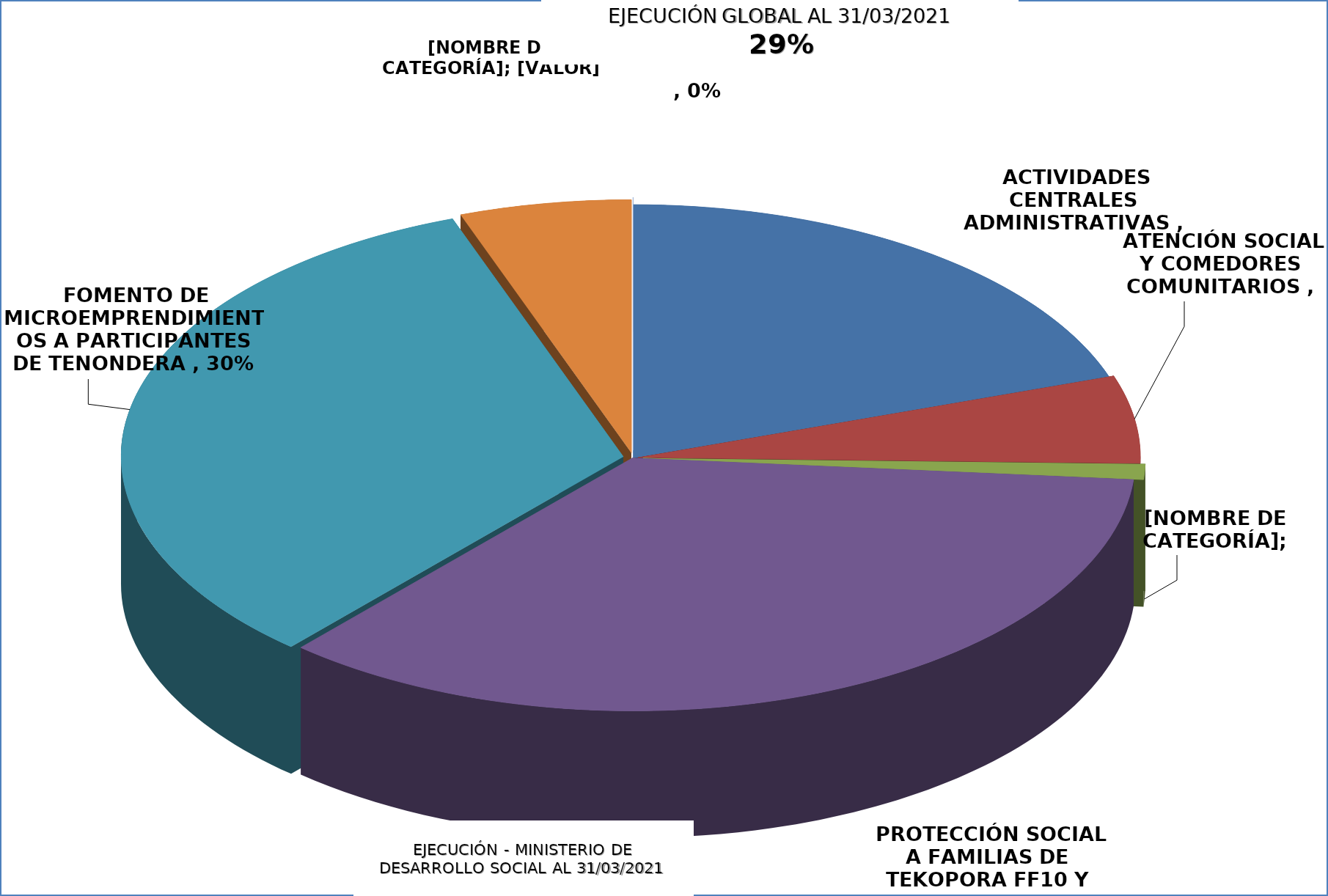
| Category |  EJECUCIÓN - MINISTERIO DE DESARROLLO SOCIAL  |
|---|---|
|  ACTIVIDADES CENTRALES ADMINISTRATIVAS  | 0.177 |
|  ATENCIÓN SOCIAL Y COMEDORES COMUNITARIOS  | 0.05 |
|  ASISTENCIA A PESCADORES POR VEDA PESQUERA  | 0.009 |
|  PROTECCIÓN SOCIAL A FAMILIAS DE TEKOPORA FF10 Y FF20  | 0.315 |
|  FOMENTO DE MICROEMPRENDIMIENTOS A PARTICIPANTES DE TENONDERA  | 0.295 |
|  REGULARIZACIÓN DE TERRITORIOS SOCIALES, TEKOHA  | 0.049 |